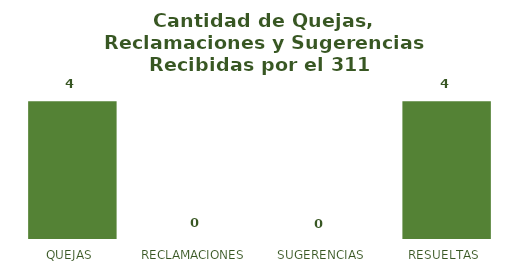
| Category | CANTIDAD |
|---|---|
| QUEJAS  | 4 |
| RECLAMACIONES  | 0 |
| SUGERENCIAS | 0 |
| RESUELTAS  | 4 |